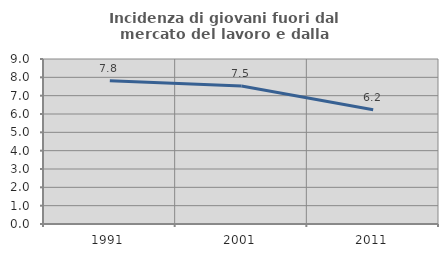
| Category | Incidenza di giovani fuori dal mercato del lavoro e dalla formazione  |
|---|---|
| 1991.0 | 7.812 |
| 2001.0 | 7.529 |
| 2011.0 | 6.235 |